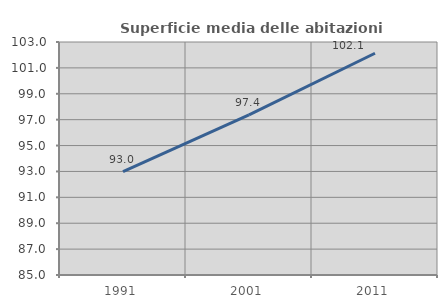
| Category | Superficie media delle abitazioni occupate |
|---|---|
| 1991.0 | 92.977 |
| 2001.0 | 97.365 |
| 2011.0 | 102.131 |